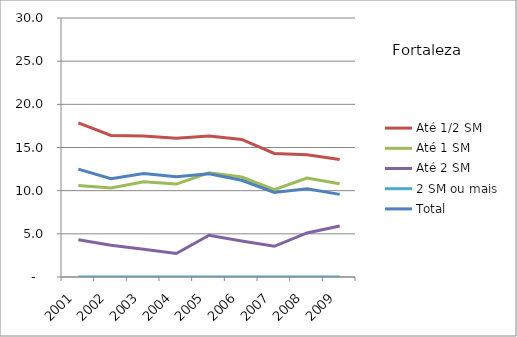
| Category | Até 1/2 SM | Até 1 SM | Até 2 SM | 2 SM ou mais | Total |
|---|---|---|---|---|---|
| 2001.0 | 17.86 | 10.61 | 4.31 | 0 | 12.5 |
| 2002.0 | 16.4 | 10.31 | 3.68 | 0 | 11.39 |
| 2003.0 | 16.32 | 11.02 | 3.21 | 0 | 11.98 |
| 2004.0 | 16.08 | 10.76 | 2.72 | 0 | 11.6 |
| 2005.0 | 16.34 | 12.08 | 4.84 | 0 | 11.96 |
| 2006.0 | 15.93 | 11.58 | 4.17 | 0 | 11.2 |
| 2007.0 | 14.31 | 10.12 | 3.56 | 0 | 9.8 |
| 2008.0 | 14.16 | 11.46 | 5.1 | 0 | 10.21 |
| 2009.0 | 13.62 | 10.8 | 5.91 | 0 | 9.57 |